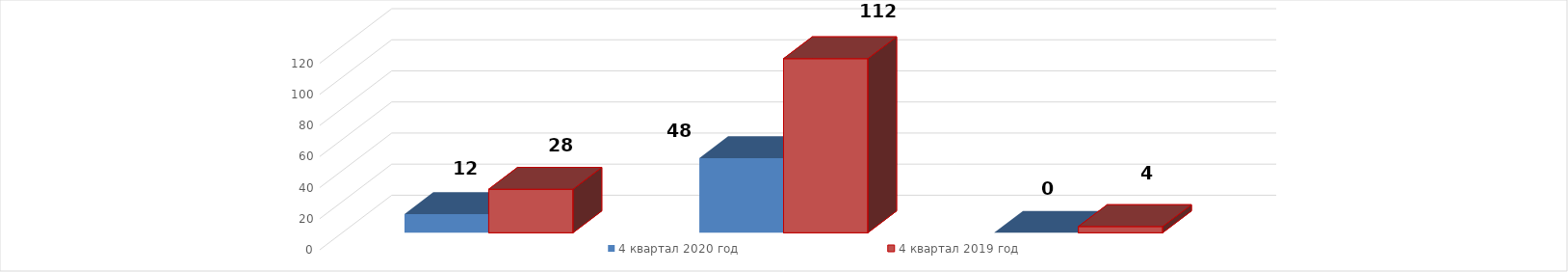
| Category | 4 квартал 2020 год | 4 квартал 2019 год |
|---|---|---|
| 0 | 12 | 28 |
| 1 | 48 | 112 |
| 2 | 0 | 4 |